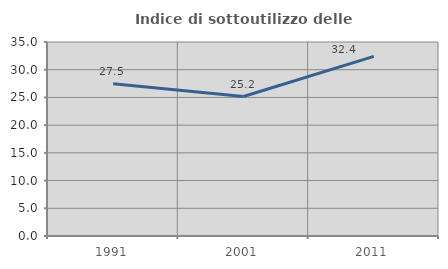
| Category | Indice di sottoutilizzo delle abitazioni  |
|---|---|
| 1991.0 | 27.481 |
| 2001.0 | 25.157 |
| 2011.0 | 32.414 |